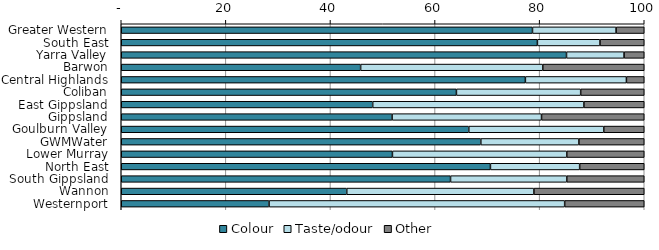
| Category | Colour | Taste/odour | Other |
|---|---|---|---|
| Greater Western | 78.632 | 15.983 | 5.385 |
| South East | 79.569 | 11.968 | 8.463 |
| Yarra Valley | 85.135 | 11.003 | 3.862 |
| Barwon | 45.771 | 34.826 | 19.403 |
| Central Highlands | 77.273 | 19.318 | 3.409 |
| Coliban | 64.088 | 23.757 | 12.155 |
| East Gippsland | 48.077 | 40.385 | 11.538 |
| Gippsland | 51.786 | 28.571 | 19.643 |
| Goulburn Valley | 66.452 | 25.806 | 7.742 |
| GWMWater | 68.75 | 18.75 | 12.5 |
| Lower Murray | 51.852 | 33.333 | 14.815 |
| North East | 70.588 | 17.059 | 12.353 |
| South Gippsland | 62.963 | 22.222 | 14.815 |
| Wannon | 43.119 | 35.78 | 21.101 |
| Westernport | 28.261 | 56.522 | 15.217 |